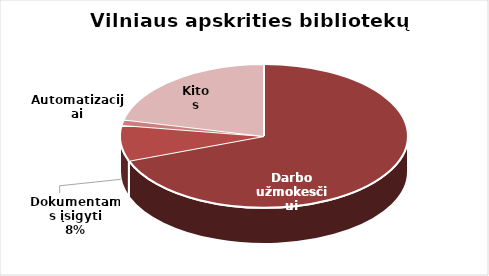
| Category | Series 0 |
|---|---|
| Darbo užmokesčiui | 3698806 |
| Dokumentams įsigyti | 430827 |
| Automatizacijai | 64224 |
| Kitos | 1139097 |